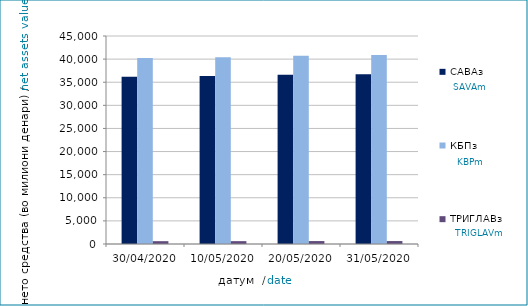
| Category | САВАз | КБПз | ТРИГЛАВз |
|---|---|---|---|
| 30/04/2020 | 36174.046 | 40224.133 | 610.319 |
| 10/05/2020 | 36345.7 | 40424.155 | 615.345 |
| 20/05/2020 | 36608.834 | 40722.852 | 633.973 |
| 31/05/2020 | 36715.769 | 40892.939 | 636.557 |